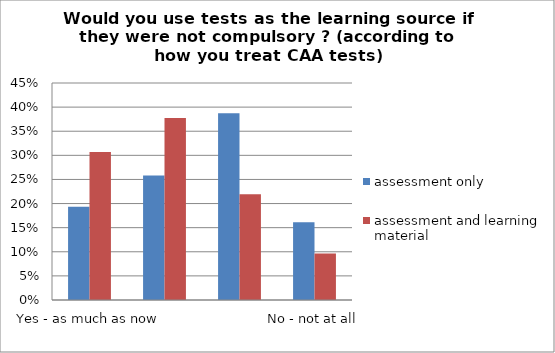
| Category | assessment only | assessment and learning material |
|---|---|---|
| Yes - as much as now | 0.194 | 0.307 |
| Once or twice per test only | 0.258 | 0.377 |
| I would look at the tests but only for the feedback | 0.387 | 0.219 |
| No - not at all | 0.161 | 0.096 |